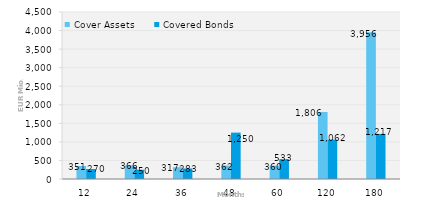
| Category | Cover Assets | Covered Bonds |
|---|---|---|
| 12.0 | 350.646 | 270 |
| 24.0 | 366.026 | 250 |
| 36.0 | 316.54 | 283 |
| 48.0 | 362.466 | 1250 |
| 60.0 | 360.345 | 532.581 |
| 120.0 | 1806.426 | 1062.112 |
| 180.0 | 3955.997 | 1217 |